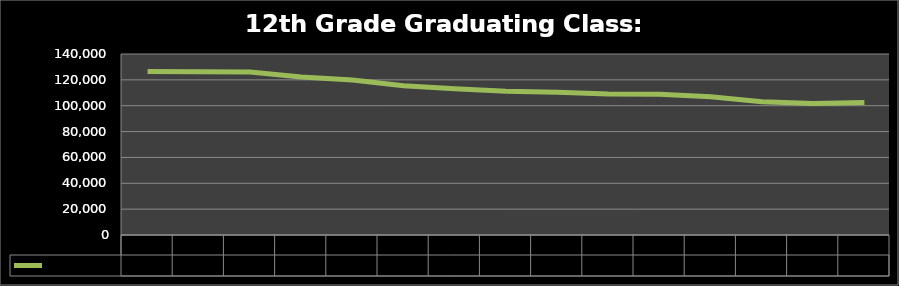
| Category | 12th Grade |
|---|---|
| 2008.0 | 126380 |
| 2009.0 | 126352 |
| 2010.0 | 126012 |
| 2011.0 | 122184.851 |
| 2012.0 | 119868.915 |
| 2013.0 | 115523.467 |
| 2014.0 | 113168.025 |
| 2015.0 | 111254.931 |
| 2016.0 | 110482.809 |
| 2017.0 | 109044.769 |
| 2018.0 | 108907.752 |
| 2019.0 | 106942.204 |
| 2020.0 | 103023.701 |
| 2021.0 | 101640.953 |
| 2022.0 | 102483.247 |